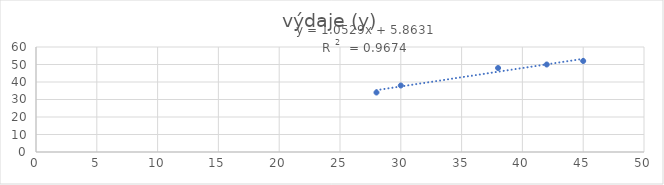
| Category | výdaje (y) |
|---|---|
| 28.0 | 34 |
| 30.0 | 38 |
| 38.0 | 48 |
| 42.0 | 50 |
| 45.0 | 52 |